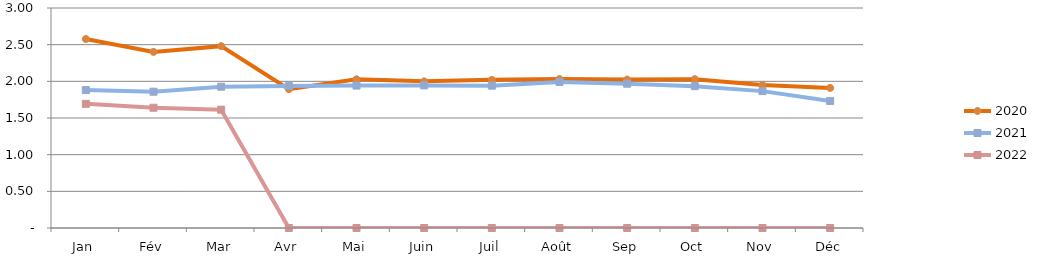
| Category | 2020 | 2021 | 2022 |
|---|---|---|---|
| Jan | 2.576 | 1.881 | 1.693 |
| Fév | 2.401 | 1.858 | 1.64 |
| Mar | 2.48 | 1.927 | 1.613 |
| Avr | 1.893 | 1.936 | 0 |
| Mai | 2.028 | 1.942 | 0 |
| Juin | 2 | 1.945 | 0 |
| Juil | 2.021 | 1.941 | 0 |
| Août | 2.031 | 1.991 | 0 |
| Sep | 2.024 | 1.968 | 0 |
| Oct | 2.03 | 1.934 | 0 |
| Nov | 1.95 | 1.867 | 0 |
| Déc | 1.91 | 1.733 | 0 |